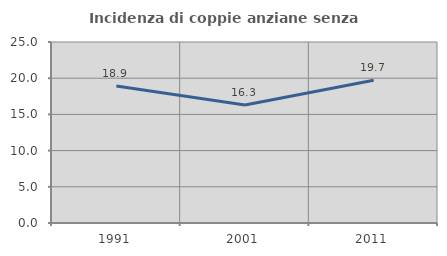
| Category | Incidenza di coppie anziane senza figli  |
|---|---|
| 1991.0 | 18.91 |
| 2001.0 | 16.287 |
| 2011.0 | 19.723 |